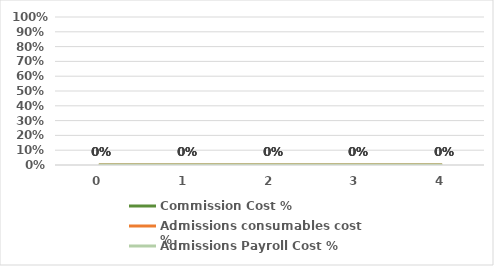
| Category | Commission Cost % | Admissions consumables cost  % | Admissions Payroll Cost % |
|---|---|---|---|
| 0.0 | 0 | 0 | 0 |
| 1.0 | 0 | 0 | 0 |
| 2.0 | 0 | 0 | 0 |
| 3.0 | 0 | 0 | 0 |
| 4.0 | 0 | 0 | 0 |